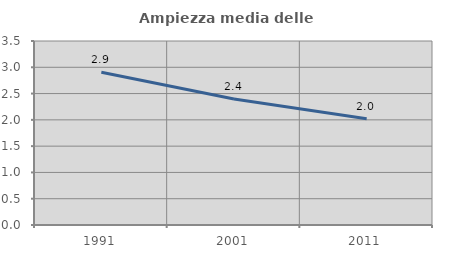
| Category | Ampiezza media delle famiglie |
|---|---|
| 1991.0 | 2.905 |
| 2001.0 | 2.395 |
| 2011.0 | 2.02 |